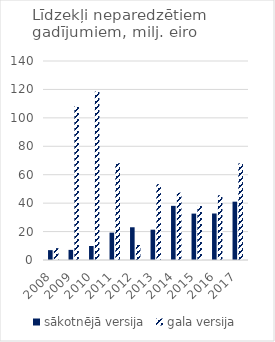
| Category | sākotnējā versija | gala versija |
|---|---|---|
| 2008.0 | 6.936 | 8.359 |
| 2009.0 | 7.114 | 108.107 |
| 2010.0 | 9.865 | 118.475 |
| 2011.0 | 19.243 | 68.096 |
| 2012.0 | 23.027 | 10.564 |
| 2013.0 | 21.322 | 53.349 |
| 2014.0 | 38.099 | 47.38 |
| 2015.0 | 32.643 | 38.064 |
| 2016.0 | 32.717 | 45.554 |
| 2017.0 | 41.035 | 68.021 |